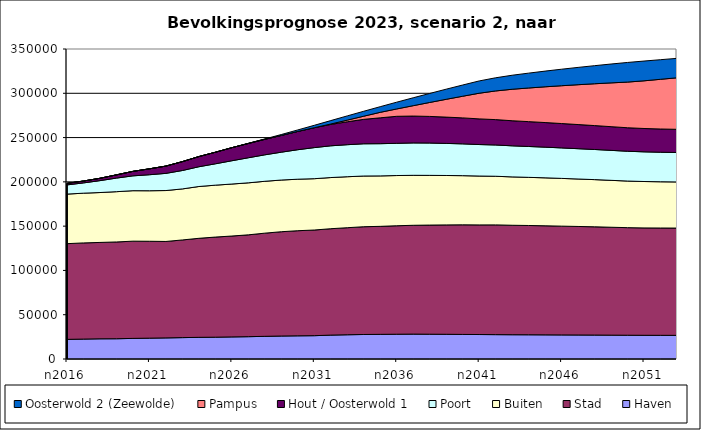
| Category | Haven | Stad | Buiten | Poort | Hout / Oosterwold 1 | Pampus | Oosterwold 2 (Zeewolde) |
|---|---|---|---|---|---|---|---|
| n2016 | 22163 | 108058 | 55963 | 10380 | 1735 | 0 | 0 |
| n2017 | 22476 | 108596 | 56136 | 11625 | 2084 | 0 | 0 |
| n2018 | 22795 | 108811 | 56339 | 13431 | 2652 | 0 | 0 |
| n2019 | 22863 | 109274 | 56769 | 15350 | 3639 | 0 | 0 |
| n2020 | 23263 | 109776 | 56980 | 16767 | 5055 | 0 | 0 |
| n2021 | 23531 | 109402 | 57019 | 18097 | 6659 | 0 | 0 |
| n2022 | 23825 | 108881 | 57500 | 19386 | 8207 | 0 | 0 |
| n2023 | 24139 | 110270 | 57621 | 20778 | 10033 | 0 | 0 |
| n2024 | 24467 | 111808 | 58472 | 22310 | 11499 | 0 | 0 |
| n2025 | 24613 | 113043 | 58603 | 24116 | 13055 | 0 | 0 |
| n2026 | 24944 | 113902 | 58695 | 26304 | 14722 | 0 | 0 |
| n2027 | 25196 | 114981 | 58719 | 28318 | 16122 | 0 | 178 |
| n2028 | 25582 | 116513 | 58551 | 29876 | 17518 | 0 | 430 |
| n2029 | 25943 | 117750 | 58366 | 31446 | 18923 | 0 | 1021 |
| n2030 | 26162 | 118678 | 58139 | 33313 | 20654 | 0 | 1689 |
| n2031 | 26330 | 119295 | 57952 | 35101 | 22479 | 0 | 2687 |
| n2032 | 26976 | 120118 | 57760 | 35856 | 24136 | 475 | 3861 |
| n2033 | 27369 | 120856 | 57559 | 36166 | 25893 | 1857 | 4773 |
| n2034 | 27678 | 121664 | 57243 | 36409 | 27585 | 3553 | 5577 |
| n2035 | 27830 | 121927 | 56961 | 36393 | 29189 | 6218 | 6363 |
| n2036 | 27972 | 122462 | 56702 | 36386 | 30489 | 8306 | 7639 |
| n2037 | 28109 | 122860 | 56412 | 36562 | 30354 | 11716 | 8920 |
| n2038 | 27990 | 123213 | 56125 | 36513 | 30045 | 15761 | 10181 |
| n2039 | 27893 | 123502 | 55793 | 36215 | 29690 | 20104 | 11436 |
| n2040 | 27743 | 123743 | 55513 | 35902 | 29330 | 24436 | 12667 |
| n2041 | 27629 | 123756 | 55181 | 35576 | 28965 | 28961 | 13871 |
| n2042 | 27515 | 123914 | 54894 | 35316 | 28637 | 32359 | 14859 |
| n2043 | 27400 | 123603 | 54595 | 35090 | 28313 | 35550 | 15817 |
| n2044 | 27347 | 123386 | 54359 | 34861 | 28049 | 37974 | 16775 |
| n2045 | 27265 | 123139 | 54136 | 34643 | 27776 | 40354 | 17710 |
| n2046 | 27173 | 122842 | 53887 | 34439 | 27510 | 42691 | 18635 |
| n2047 | 27098 | 122548 | 53579 | 34216 | 27258 | 44990 | 19534 |
| n2048 | 27039 | 122220 | 53270 | 34024 | 26983 | 47229 | 20407 |
| n2049 | 26936 | 121821 | 52954 | 33851 | 26752 | 49435 | 21284 |
| n2050 | 26846 | 121454 | 52607 | 33661 | 26504 | 51597 | 22131 |
| n2051 | 26763 | 121222 | 52401 | 33503 | 26355 | 53824 | 22318 |
| n2052 | 26730 | 121161 | 52210 | 33358 | 26230 | 56106 | 22136 |
| n2053 | 26701 | 121117 | 52091 | 33267 | 26131 | 58174 | 21958 |